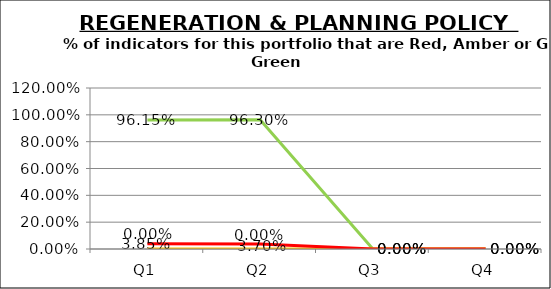
| Category | Green | Amber | Red |
|---|---|---|---|
| Q1 | 0.962 | 0 | 0.038 |
| Q2 | 0.963 | 0 | 0.037 |
| Q3 | 0 | 0 | 0 |
| Q4 | 0 | 0 | 0 |